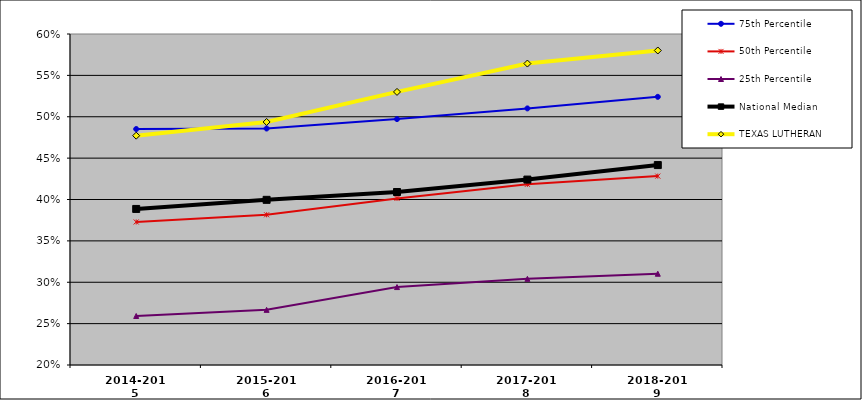
| Category | 75th Percentile | 50th Percentile | 25th Percentile | National Median | TEXAS LUTHERAN |
|---|---|---|---|---|---|
| 2014-2015 | 0.485 | 0.373 | 0.259 | 0.389 | 0.477 |
| 2015-2016 | 0.486 | 0.382 | 0.267 | 0.4 | 0.494 |
| 2016-2017 | 0.497 | 0.401 | 0.294 | 0.409 | 0.53 |
| 2017-2018 | 0.51 | 0.418 | 0.304 | 0.424 | 0.564 |
| 2018-2019 | 0.524 | 0.428 | 0.31 | 0.442 | 0.58 |